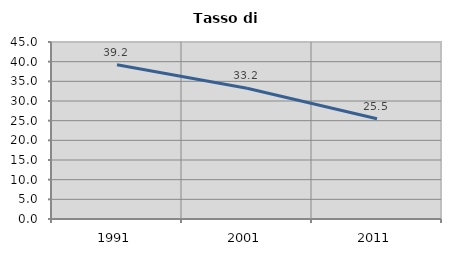
| Category | Tasso di disoccupazione   |
|---|---|
| 1991.0 | 39.194 |
| 2001.0 | 33.22 |
| 2011.0 | 25.504 |